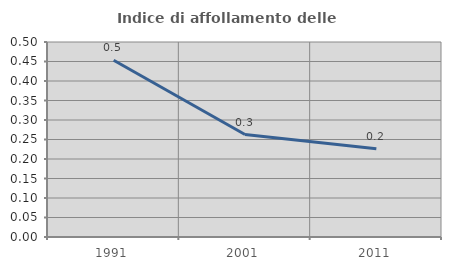
| Category | Indice di affollamento delle abitazioni  |
|---|---|
| 1991.0 | 0.453 |
| 2001.0 | 0.263 |
| 2011.0 | 0.227 |